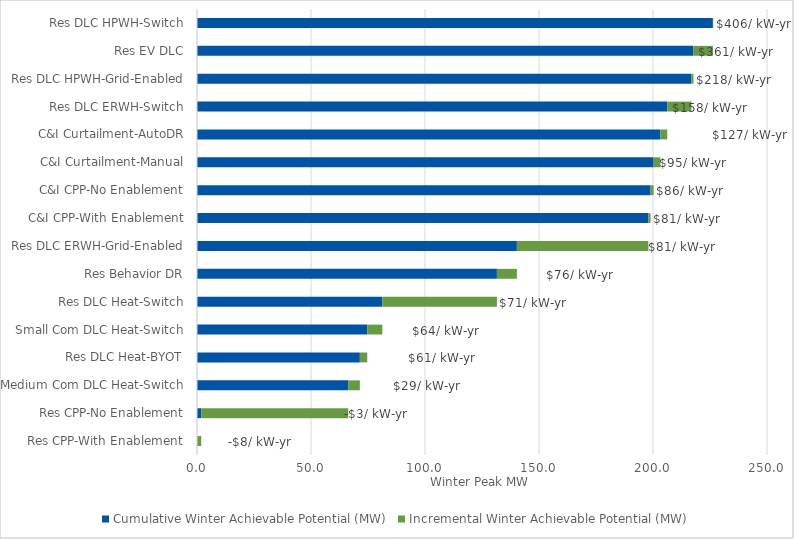
| Category | Cumulative Winter Achievable Potential (MW) | Incremental Winter Achievable Potential (MW) |
|---|---|---|
| Res CPP-With Enablement | 0 | 1.859 |
| Res CPP-No Enablement | 1.859 | 64.467 |
| Medium Com DLC Heat-Switch | 66.326 | 5.107 |
| Res DLC Heat-BYOT | 71.433 | 3.234 |
| Small Com DLC Heat-Switch | 74.666 | 6.626 |
| Res DLC Heat-Switch | 81.293 | 50.246 |
| Res Behavior DR | 131.539 | 8.762 |
| Res DLC ERWH-Grid-Enabled | 140.3 | 57.677 |
| C&I CPP-With Enablement | 197.977 | 0.959 |
| C&I CPP-No Enablement | 198.937 | 1.333 |
| C&I Curtailment-Manual | 200.27 | 2.952 |
| C&I Curtailment-AutoDR | 203.222 | 3.03 |
| Res DLC ERWH-Switch | 206.252 | 10.602 |
| Res DLC HPWH-Grid-Enabled | 216.854 | 0.888 |
| Res EV DLC | 217.742 | 8.515 |
| Res DLC HPWH-Switch | 226.258 | 0.163 |